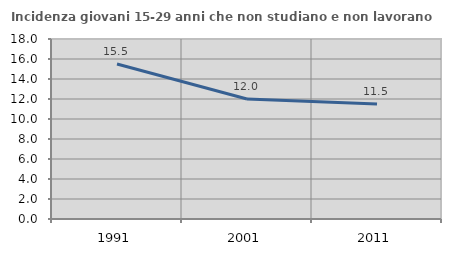
| Category | Incidenza giovani 15-29 anni che non studiano e non lavorano  |
|---|---|
| 1991.0 | 15.495 |
| 2001.0 | 12 |
| 2011.0 | 11.494 |